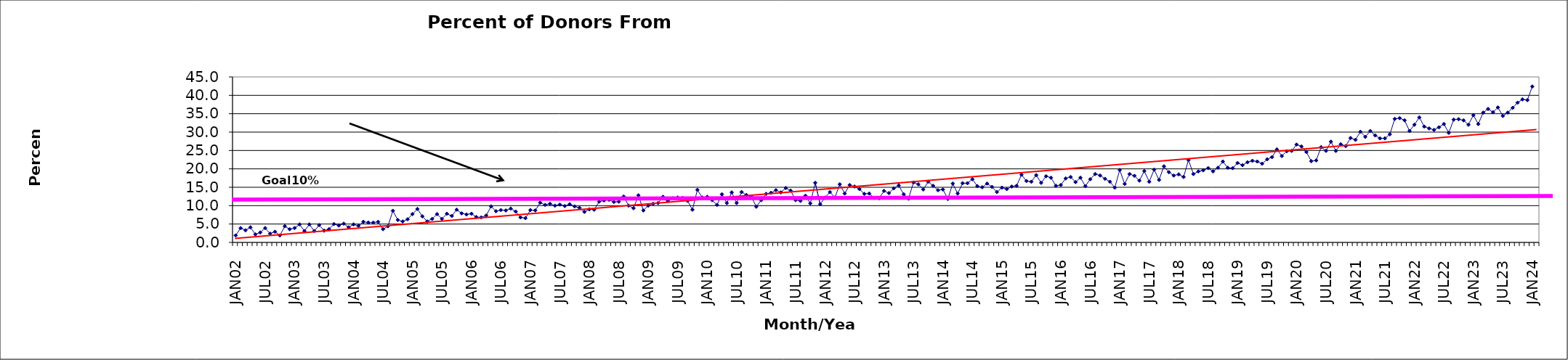
| Category | Series 0 |
|---|---|
| JAN02 | 1.9 |
| FEB02 | 3.9 |
| MAR02 | 3.3 |
| APR02 | 4.1 |
| MAY02 | 2.2 |
| JUN02 | 2.7 |
| JUL02 | 3.9 |
| AUG02 | 2.4 |
| SEP02 | 2.9 |
| OCT02 | 1.9 |
| NOV02 | 4.4 |
| DEC02 | 3.6 |
| JAN03 | 3.9 |
| FEB03 | 4.9 |
| MAR03 | 3.1 |
| APR03 | 4.9 |
| MAY03 | 3.1 |
| JUN03 | 4.7 |
| JUL03 | 3.2 |
| AUG03 | 3.6 |
| SEP03 | 5 |
| OCT03 | 4.6 |
| NOV03 | 5.1 |
| DEC03 | 4.1 |
| JAN04 | 4.9 |
| FEB04 | 4.5 |
| MAR04 | 5.6 |
| APR04 | 5.4 |
| MAY04 | 5.4 |
| JUN04 | 5.6 |
| JUL04 | 3.6 |
| AUG04 | 4.4 |
| SEP04 | 8.6 |
| OCT04 | 6.1 |
| NOV04 | 5.7 |
| DEC04 | 6.3 |
| JAN05 | 7.7 |
| FEB05 | 9.1 |
| MAR05 | 7.1 |
| APR05 | 5.7 |
| MAY05 | 6.4 |
| JUN05 | 7.7 |
| JUL05 | 6.4 |
| AUG05 | 7.8 |
| SEP05 | 7.2 |
| OCT05 | 8.9 |
| NOV05 | 7.9 |
| DEC05 | 7.6 |
| JAN06 | 7.8 |
| FEB06 | 6.9 |
| MAR06 | 6.8 |
| APR06 | 7.3 |
| MAY06 | 9.8 |
| JUN06 | 8.5 |
| JUL06 | 8.8 |
| AUG06 | 8.7 |
| SEP06 | 9.2 |
| OCT06 | 8.4 |
| NOV06 | 6.8 |
| DEC06 | 6.6 |
| JAN07 | 8.8 |
| FEB07 | 8.7 |
| MAR07 | 10.8 |
| APR07 | 10.2 |
| MAY07 | 10.5 |
| JUN07 | 10 |
| JUL07 | 10.3 |
| AUG07 | 9.9 |
| SEP07 | 10.4 |
| OCT07 | 9.8 |
| NOV07 | 9.4 |
| DEC07 | 8.3 |
| JAN08 | 9 |
| FEB08 | 8.9 |
| MAR08 | 11.1 |
| APR08 | 11.4 |
| MAY08 | 11.6 |
| JUN08 | 11 |
| JUL08 | 11.1 |
| AUG08 | 12.5 |
| SEP08 | 10 |
| OCT08 | 9.3 |
| NOV08 | 12.8 |
| DEC08 | 8.7 |
| JAN09 | 10 |
| FEB09 | 10.5 |
| MAR09 | 10.7 |
| APR09 | 12.4 |
| MAY09 | 11.3 |
| JUN09 | 12 |
| JUL09 | 12.2 |
| AUG09 | 12.1 |
| SEP09 | 11.3 |
| OCT09 | 8.9 |
| NOV09 | 14.3 |
| DEC09 | 12.2 |
| JAN10 | 12.4 |
| FEB10 | 11.5 |
| MAR10 | 10.2 |
| APR10 | 13.1 |
| MAY10 | 10.7 |
| JUN10 | 13.6 |
| JUL10 | 10.7 |
| AUG10 | 13.7 |
| SEP10 | 12.9 |
| OCT10 | 12.4 |
| NOV10 | 9.7 |
| DEC10 | 11.5 |
| JAN11 | 13.2 |
| FEB11 | 13.5 |
| MAR11 | 14.2 |
| APR11 | 13.6 |
| MAY11 | 14.8 |
| JUN11 | 14.1 |
| JUL11 | 11.5 |
| AUG11 | 11.3 |
| SEP11 | 12.7 |
| OCT11 | 10.6 |
| NOV11 | 16.2 |
| DEC11 | 10.4 |
| JAN12 | 12.2 |
| FEB12 | 13.7 |
| MAR12 | 12.2 |
| APR12 | 15.8 |
| MAY12 | 13.3 |
| JUN12 | 15.6 |
| JUL12 | 15.2 |
| AUG12 | 14.5 |
| SEP12 | 13.2 |
| OCT12 | 13.3 |
| NOV12 | 12.1 |
| DEC12 | 12 |
| JAN13 | 14 |
| FEB13 | 13.4 |
| MAR13 | 14.7 |
| APR13 | 15.5 |
| MAY13 | 13.1 |
| JUN13 | 11.9 |
| JUL13 | 16.3 |
| AUG13 | 15.8 |
| SEP13 | 14.4 |
| OCT13 | 16.5 |
| NOV13 | 15.4 |
| DEC13 | 14.2 |
| JAN14 | 14.4 |
| FEB14 | 11.8 |
| MAR14 | 16 |
| APR14 | 13.3 |
| MAY14 | 16.1 |
| JUN14 | 16.1 |
| JUL14 | 17.2 |
| AUG14 | 15.3 |
| SEP14 | 15 |
| OCT14 | 16 |
| NOV14 | 15.1 |
| DEC14 | 13.7 |
| JAN15 | 14.9 |
| FEB15 | 14.5 |
| MAR15 | 15.2 |
| APR15 | 15.4 |
| MAY15 | 18.4 |
| JUN15 | 16.7 |
| JUL15 | 16.5 |
| AUG15 | 18.3 |
| SEP15 | 16.2 |
| OCT15 | 18 |
| NOV15 | 17.6 |
| DEC15 | 15.4 |
| JAN16 | 15.6 |
| FEB16 | 17.4 |
| MAR16 | 17.8 |
| APR16 | 16.4 |
| MAY16 | 17.6 |
| JUN16 | 15.3 |
| JUL16 | 17.2 |
| AUG16 | 18.6 |
| SEP16 | 18.2 |
| OCT16 | 17.3 |
| NOV16 | 16.5 |
| DEC16 | 14.9 |
| JAN17 | 19.7 |
| FEB17 | 15.9 |
| MAR17 | 18.6 |
| APR17 | 18.1 |
| MAY17 | 16.8 |
| JUN17 | 19.4 |
| JUL17 | 16.5 |
| AUG17 | 19.8 |
| SEP17 | 17 |
| OCT17 | 20.7 |
| NOV17 | 19.1 |
| DEC17 | 18.2 |
| JAN18 | 18.5 |
| FEB18 | 17.8 |
| MAR18 | 22.4 |
| APR18 | 18.6 |
| MAY18 | 19.3 |
| JUN18 | 19.6 |
| JUL18 | 20.2 |
| AUG18 | 19.3 |
| SEP18 | 20.3 |
| OCT18 | 22 |
| NOV18 | 20.3 |
| DEC18 | 20.2 |
| JAN19 | 21.6 |
| FEB19 | 21 |
| MAR19 | 21.8 |
| APR19 | 22.2 |
| MAY19 | 22 |
| JUN19 | 21.4 |
| JUL19 | 22.6 |
| AUG19 | 23.2 |
| SEP19 | 25.3 |
| OCT19 | 23.5 |
| NOV19 | 24.8 |
| DEC19 | 24.9 |
| JAN20 | 26.6 |
| FEB20 | 26.1 |
| MAR20 | 24.6 |
| APR20 | 22.1 |
| MAY20 | 22.3 |
| JUN20 | 25.9 |
| JUL20 | 24.9 |
| AUG20 | 27.4 |
| SEP20 | 24.9 |
| OCT20 | 26.7 |
| NOV20 | 26.2 |
| DEC20 | 28.4 |
| JAN21 | 27.9 |
| FEB21 | 30.1 |
| MAR21 | 28.7 |
| APR21 | 30.3 |
| MAY21 | 29.1 |
| JUN21 | 28.3 |
| JUL21 | 28.3 |
| AUG21 | 29.4 |
| SEP21 | 33.6 |
| OCT21 | 33.8 |
| NOV21 | 33.2 |
| DEC21 | 30.3 |
| JAN22 | 32 |
| FEB22 | 34 |
| MAR22 | 31.5 |
| APR22 | 31 |
| MAY22 | 30.6 |
| JUN22 | 31.3 |
| JUL22 | 32.2 |
| AUG22 | 29.8 |
| SEP22 | 33.4 |
| OCT22 | 33.5 |
| NOV22 | 33.2 |
| DEC22 | 32 |
| JAN23 | 34.6 |
| FEB23 | 32.2 |
| MAR23 | 35.3 |
| APR23 | 36.3 |
| MAY23 | 35.4 |
| JUN23 | 36.7 |
| JUL23 | 34.4 |
| AUG23 | 35.3 |
| SEP23 | 36.6 |
| OCT23 | 38 |
| NOV23 | 38.9 |
| DEC23 | 38.7 |
| JAN24 | 42.4 |